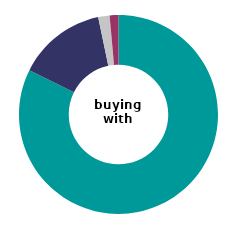
| Category | buying mortgage |
|---|---|
| very satisfied | 82.341 |
| fairly satisfied | 14.379 |
| neither satisfied nor dissatisfied | 1.854 |
| slightly or very dissatisfied | 1.426 |